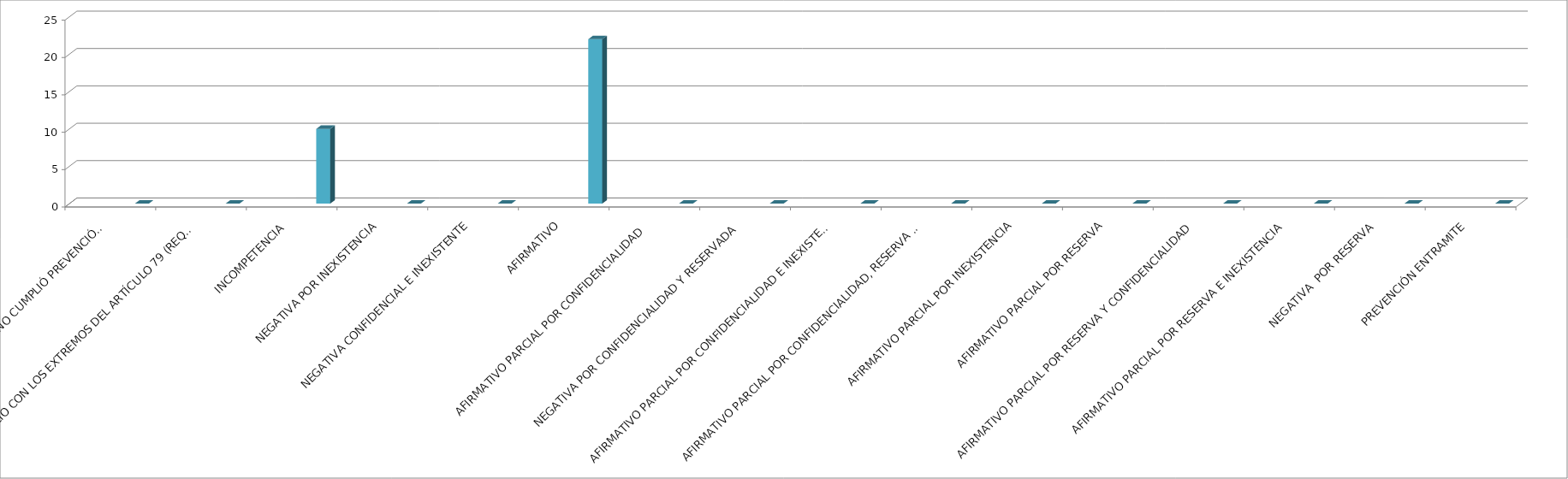
| Category | Series 0 | Series 1 | Series 2 | Series 3 | Series 4 |
|---|---|---|---|---|---|
| SE TIENE POR NO PRESENTADA ( NO CUMPLIÓ PREVENCIÓN) |  |  |  |  | 0 |
| NO CUMPLIO CON LOS EXTREMOS DEL ARTÍCULO 79 (REQUISITOS) |  |  |  |  | 0 |
| INCOMPETENCIA  |  |  |  |  | 10 |
| NEGATIVA POR INEXISTENCIA |  |  |  |  | 0 |
| NEGATIVA CONFIDENCIAL E INEXISTENTE |  |  |  |  | 0 |
| AFIRMATIVO |  |  |  |  | 22 |
| AFIRMATIVO PARCIAL POR CONFIDENCIALIDAD  |  |  |  |  | 0 |
| NEGATIVA POR CONFIDENCIALIDAD Y RESERVADA |  |  |  |  | 0 |
| AFIRMATIVO PARCIAL POR CONFIDENCIALIDAD E INEXISTENCIA |  |  |  |  | 0 |
| AFIRMATIVO PARCIAL POR CONFIDENCIALIDAD, RESERVA E INEXISTENCIA |  |  |  |  | 0 |
| AFIRMATIVO PARCIAL POR INEXISTENCIA |  |  |  |  | 0 |
| AFIRMATIVO PARCIAL POR RESERVA |  |  |  |  | 0 |
| AFIRMATIVO PARCIAL POR RESERVA Y CONFIDENCIALIDAD |  |  |  |  | 0 |
| AFIRMATIVO PARCIAL POR RESERVA E INEXISTENCIA |  |  |  |  | 0 |
| NEGATIVA  POR RESERVA |  |  |  |  | 0 |
| PREVENCIÓN ENTRAMITE |  |  |  |  | 0 |